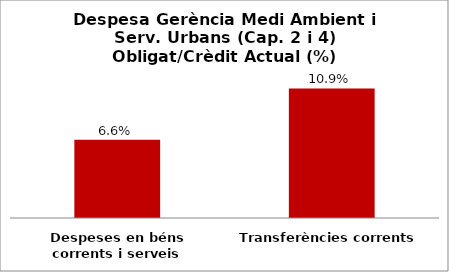
| Category | Series 0 |
|---|---|
| Despeses en béns corrents i serveis | 0.066 |
| Transferències corrents | 0.109 |